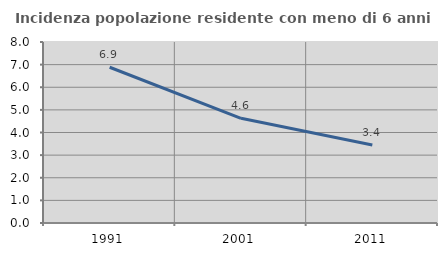
| Category | Incidenza popolazione residente con meno di 6 anni |
|---|---|
| 1991.0 | 6.883 |
| 2001.0 | 4.627 |
| 2011.0 | 3.447 |